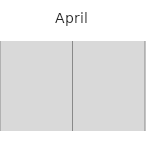
| Category | 1 | Fill 1 | 2 | Fill 2 | 3 | Fill 3 | 4 | Fill 4 | 5 | Fill 5 | 6 | Fill 6 | 7 | Fill 7 | 8 | Fill 8 | 9 | Fill 9 | 10 | Fill 10 | 11 | Fill 11 | 12 | Fill 12 | 13 | Fill 13 | 14 | Fill 14 | 15 | Fill 15 | 16 | Fill 16 | 17 | Fill 17 | 18 | Fill 18 | 19 | Fill 19 | 20 | Fill 20 | 21 | Fill 21 | 22 | Fill 22 | 23 | Fill 23 | 24 | Fill 24 | 25 | Fill 25 | 26 | Fill 26 | 27 | Fill 27 | 28 | Fill 28 | 29 | Fill 29 | 30 | Fill 30 |
|---|---|---|---|---|---|---|---|---|---|---|---|---|---|---|---|---|---|---|---|---|---|---|---|---|---|---|---|---|---|---|---|---|---|---|---|---|---|---|---|---|---|---|---|---|---|---|---|---|---|---|---|---|---|---|---|---|---|---|---|---|
| R | 0 | 1 | 0 | 1 | 0 | 1 | 0 | 1 | 0 | 1 | 0 | 1 | 0 | 1 | 0 | 1 | 0 | 1 | 0 | 1 | 0 | 1 | 0 | 1 | 0 | 1 | 0 | 1 | 0 | 1 | 0 | 1 | 0 | 1 | 0 | 1 | 0 | 1 | 0 | 1 | 0 | 1 | 0 | 1 | 0 | 1 | 0 | 1 | 0 | 1 | 0 | 1 | 0 | 1 | 0 | 1 | 0 | 1 | 0 | 1 |
| M | 0 | 1 | 0 | 1 | 0 | 1 | 0 | 1 | 0 | 1 | 0 | 1 | 0 | 1 | 0 | 1 | 0 | 1 | 0 | 1 | 0 | 1 | 0 | 1 | 0 | 1 | 0 | 1 | 0 | 1 | 0 | 1 | 0 | 1 | 0 | 1 | 0 | 1 | 0 | 1 | 0 | 1 | 0 | 1 | 0 | 1 | 0 | 1 | 0 | 1 | 0 | 1 | 0 | 1 | 0 | 1 | 0 | 1 | 0 | 1 |
| U1 | 0 | 1 | 0 | 1 | 0 | 1 | 0 | 1 | 0 | 1 | 0 | 1 | 0 | 1 | 0 | 1 | 0 | 1 | 0 | 1 | 0 | 1 | 0 | 1 | 0 | 1 | 0 | 1 | 0 | 1 | 0 | 1 | 0 | 1 | 0 | 1 | 0 | 1 | 0 | 1 | 0 | 1 | 0 | 1 | 0 | 1 | 0 | 1 | 0 | 1 | 0 | 1 | 0 | 1 | 0 | 1 | 0 | 1 | 0 | 1 |
| U2 | 0 | 1 | 0 | 1 | 0 | 1 | 0 | 1 | 0 | 1 | 0 | 1 | 0 | 1 | 0 | 1 | 0 | 1 | 0 | 1 | 0 | 1 | 0 | 1 | 0 | 1 | 0 | 1 | 0 | 1 | 0 | 1 | 0 | 1 | 0 | 1 | 0 | 1 | 0 | 1 | 0 | 1 | 0 | 1 | 0 | 1 | 0 | 1 | 0 | 1 | 0 | 1 | 0 | 1 | 0 | 1 | 0 | 1 | 0 | 1 |
| U3 | 0 | 1 | 0 | 1 | 0 | 1 | 0 | 1 | 0 | 1 | 0 | 1 | 0 | 1 | 0 | 1 | 0 | 1 | 0 | 1 | 0 | 1 | 0 | 1 | 0 | 1 | 0 | 1 | 0 | 1 | 0 | 1 | 0 | 1 | 0 | 1 | 0 | 1 | 0 | 1 | 0 | 1 | 0 | 1 | 0 | 1 | 0 | 1 | 0 | 1 | 0 | 1 | 0 | 1 | 0 | 1 | 0 | 1 | 0 | 1 |